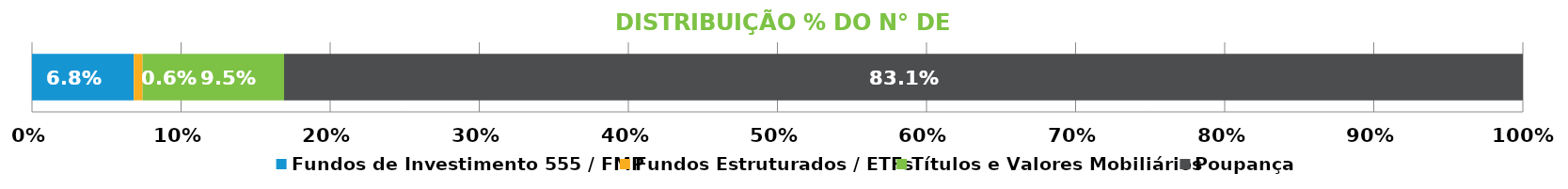
| Category | Fundos de Investimento 555 / FMP | Fundos Estruturados / ETFs | Títulos e Valores Mobiliários | Poupança |
|---|---|---|---|---|
| 0 | 0.068 | 0.006 | 0.095 | 0.831 |